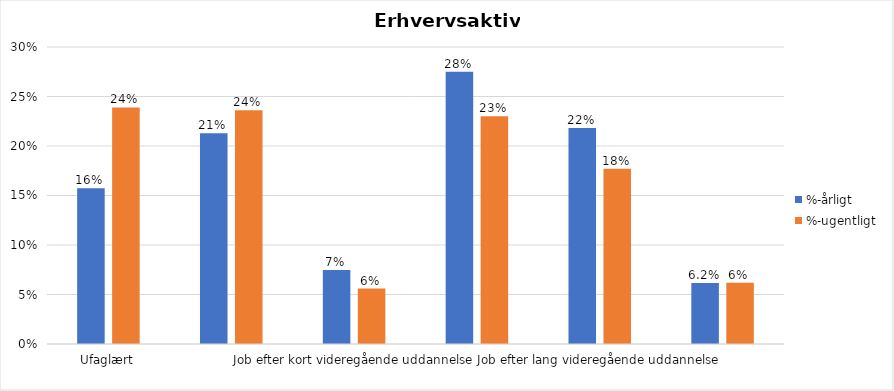
| Category | %-årligt | %-ugentligt |
|---|---|---|
| Ufaglært | 0.157 | 0.239 |
| Erhvervsfagligt job | 0.213 | 0.236 |
| Job efter kort videregående uddannelse | 0.075 | 0.056 |
| Job efter mellemlang videregående uddannelse | 0.275 | 0.23 |
| Job efter lang videregående uddannelse | 0.218 | 0.177 |
| Selvstændig | 0.062 | 0.062 |